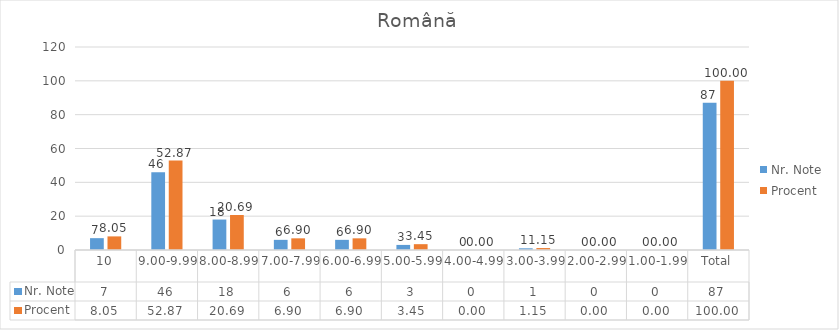
| Category | Nr. Note | Procent |
|---|---|---|
| 10 | 7 | 8.046 |
| 9.00-9.99 | 46 | 52.874 |
| 8.00-8.99 | 18 | 20.69 |
| 7.00-7.99 | 6 | 6.897 |
| 6.00-6.99 | 6 | 6.897 |
| 5.00-5.99 | 3 | 3.448 |
| 4.00-4.99 | 0 | 0 |
| 3.00-3.99 | 1 | 1.149 |
| 2.00-2.99 | 0 | 0 |
| 1.00-1.99 | 0 | 0 |
| Total | 87 | 100 |